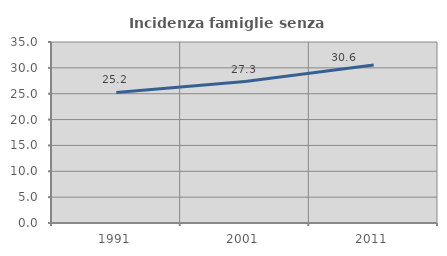
| Category | Incidenza famiglie senza nuclei |
|---|---|
| 1991.0 | 25.241 |
| 2001.0 | 27.345 |
| 2011.0 | 30.556 |